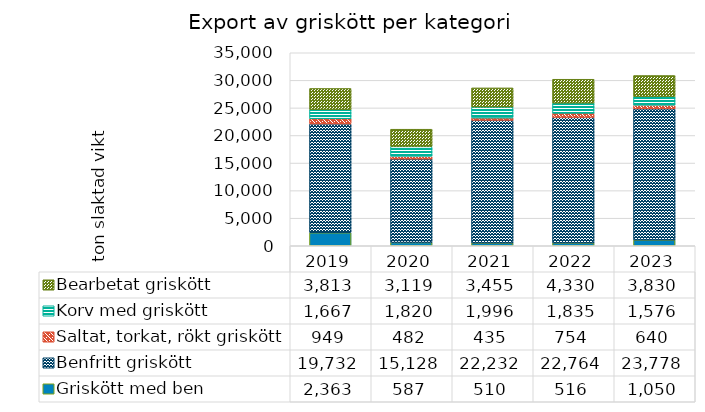
| Category | Griskött med ben | Benfritt griskött | Saltat, torkat, rökt griskött | Korv med griskött | Bearbetat griskött |
|---|---|---|---|---|---|
| 2019 | 2363 | 19732.099 | 949.438 | 1666.605 | 3813.333 |
| 2020 | 587 | 15128.395 | 482.022 | 1820 | 3119.012 |
| 2021 | 510 | 22232.099 | 434.831 | 1995.864 | 3454.815 |
| 2022 | 516 | 22764.198 | 753.933 | 1834.691 | 4329.877 |
| 2023 | 1050 | 23777.778 | 640.449 | 1576.296 | 3830.123 |